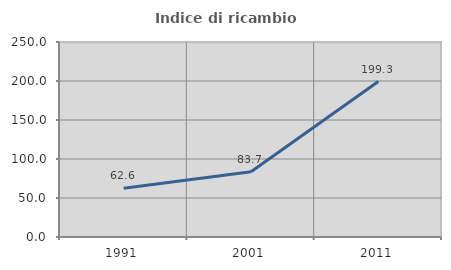
| Category | Indice di ricambio occupazionale  |
|---|---|
| 1991.0 | 62.556 |
| 2001.0 | 83.721 |
| 2011.0 | 199.291 |